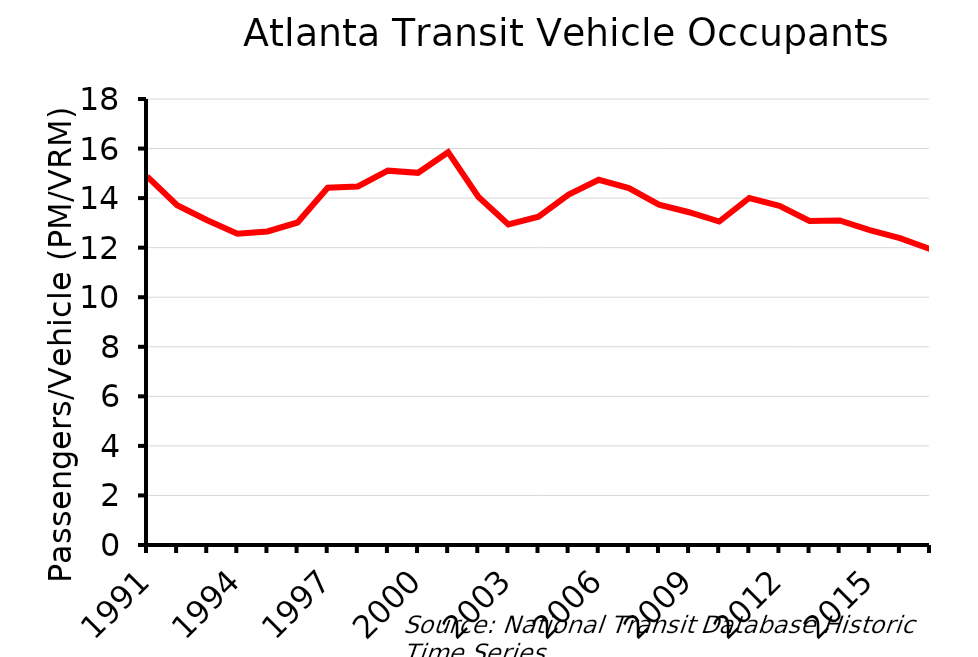
| Category | PM/VRM |
|---|---|
| 1991.0 | 14.876 |
| 1992.0 | 13.715 |
| 1993.0 | 13.11 |
| 1994.0 | 12.566 |
| 1995.0 | 12.656 |
| 1996.0 | 13.016 |
| 1997.0 | 14.418 |
| 1998.0 | 14.469 |
| 1999.0 | 15.108 |
| 2000.0 | 15.02 |
| 2001.0 | 15.853 |
| 2002.0 | 14.053 |
| 2003.0 | 12.939 |
| 2004.0 | 13.248 |
| 2005.0 | 14.141 |
| 2006.0 | 14.74 |
| 2007.0 | 14.406 |
| 2008.0 | 13.737 |
| 2009.0 | 13.43 |
| 2010.0 | 13.055 |
| 2011.0 | 14.005 |
| 2012.0 | 13.689 |
| 2013.0 | 13.081 |
| 2014.0 | 13.099 |
| 2015.0 | 12.711 |
| 2016.0 | 12.385 |
| 2017.0 | 11.944 |